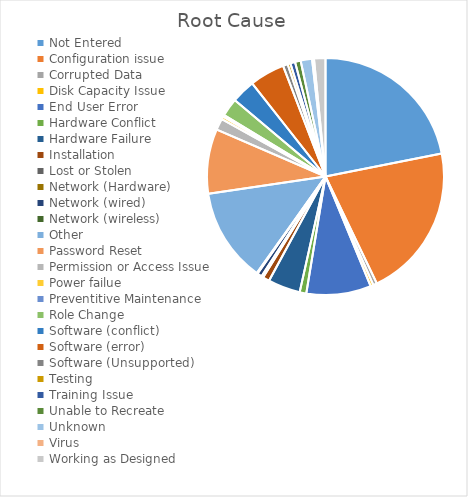
| Category | Series 0 |
|---|---|
| Not Entered | 169 |
| Configuration issue | 162 |
| Corrupted Data | 4 |
| Disk Capacity Issue | 3 |
| End User Error | 68 |
| Hardware Conflict | 7 |
| Hardware Failure | 34 |
| Installation | 7 |
| Lost or Stolen | 1 |
| Network (Hardware) | 1 |
| Network (wired) | 5 |
| Network (wireless) | 1 |
| Other | 99 |
| Password Reset | 68 |
| Permission or Access Issue | 12 |
| Power failue | 3 |
| Preventitive Maintenance | 2 |
| Role Change | 19 |
| Software (conflict) | 25 |
| Software (error) | 37 |
| Software (Unsupported) | 5 |
| Testing | 3 |
| Training Issue | 5 |
| Unable to Recreate | 6 |
| Unknown | 12 |
| Virus | 2 |
| Working as Designed | 12 |